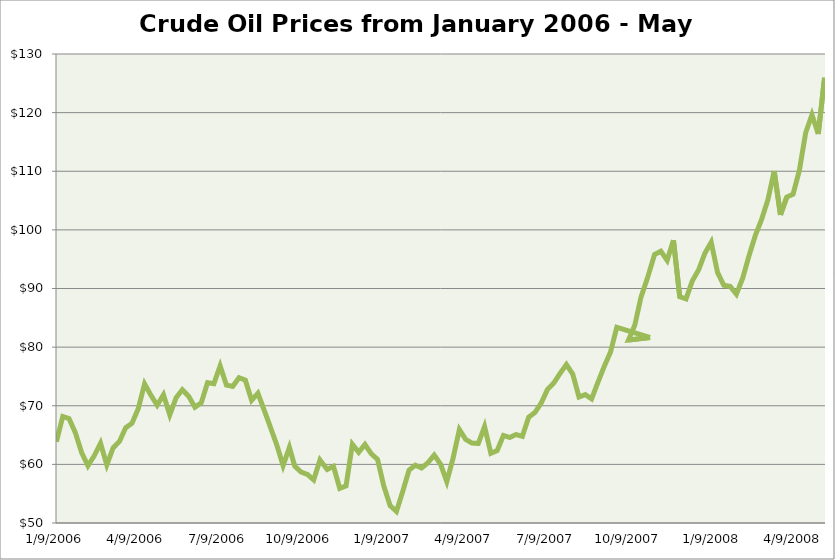
| Category | Series 0 |
|---|---|
| 1/9/06 | 63.86 |
| 1/16/06 | 68.16 |
| 1/23/06 | 67.81 |
| 1/30/06 | 65.41 |
| 2/6/06 | 62.01 |
| 2/13/06 | 59.76 |
| 2/20/06 | 61.46 |
| 2/27/06 | 63.61 |
| 3/6/06 | 59.91 |
| 3/13/06 | 62.81 |
| 3/20/06 | 63.9 |
| 3/27/06 | 66.25 |
| 4/3/06 | 67.02 |
| 4/10/06 | 69.53 |
| 4/17/06 | 73.73 |
| 4/24/06 | 71.8 |
| 5/1/06 | 70.09 |
| 5/8/06 | 71.87 |
| 5/15/06 | 68.44 |
| 5/22/06 | 71.35 |
| 5/29/06 | 72.73 |
| 6/5/06 | 71.62 |
| 6/12/06 | 69.75 |
| 6/19/06 | 70.5 |
| 6/26/06 | 73.94 |
| 7/3/06 | 73.76 |
| 7/10/06 | 76.8 |
| 7/17/06 | 73.52 |
| 7/24/06 | 73.3 |
| 7/31/06 | 74.78 |
| 8/7/06 | 74.38 |
| 8/14/06 | 70.93 |
| 8/21/06 | 72.13 |
| 8/28/06 | 69.24 |
| 9/4/06 | 66.3 |
| 9/11/06 | 63.3 |
| 9/18/06 | 59.79 |
| 9/25/06 | 62.9 |
| 10/1/06 | 59.68 |
| 10/8/06 | 58.69 |
| 10/15/06 | 58.29 |
| 10/22/06 | 57.35 |
| 10/29/06 | 60.75 |
| 11/6/06 | 59.13 |
| 11/13/06 | 59.66 |
| 11/20/06 | 55.9 |
| 11/27/06 | 56.33 |
| 12/4/06 | 63.43 |
| 12/11/06 | 62.06 |
| 12/18/06 | 63.4 |
| 12/25/06 | 61.81 |
| 1/1/07 | 60.85 |
| 1/8/07 | 56.29 |
| 1/15/07 | 52.96 |
| 1/22/07 | 51.98 |
| 1/29/07 | 55.38 |
| 2/5/07 | 59.01 |
| 2/12/07 | 59.86 |
| 2/19/07 | 59.38 |
| 2/26/07 | 60.28 |
| 3/5/07 | 61.58 |
| 3/12/07 | 60.06 |
| 3/19/07 | 57.06 |
| 3/26/07 | 61.07 |
| 4/2/07 | 65.94 |
| 4/9/07 | 64.26 |
| 4/16/07 | 63.63 |
| 4/23/07 | 63.56 |
| 4/30/07 | 66.45 |
| 5/7/07 | 61.89 |
| 5/14/07 | 62.35 |
| 5/21/07 | 64.93 |
| 5/28/07 | 64.59 |
| 6/4/07 | 65.09 |
| 6/11/07 | 64.78 |
| 6/18/07 | 68.04 |
| 6/25/07 | 68.85 |
| 7/2/07 | 70.47 |
| 7/9/07 | 72.8 |
| 7/16/07 | 73.89 |
| 7/23/07 | 75.53 |
| 7/30/07 | 77.03 |
| 8/6/07 | 75.41 |
| 8/13/07 | 71.49 |
| 8/20/07 | 71.9 |
| 8/27/07 | 71.17 |
| 9/3/07 | 73.98 |
| 9/10/07 | 76.7 |
| 9/17/07 | 79.14 |
| 9/24/07 | 83.38 |
| 10/31/07 | 81.64 |
| 10/7/07 | 81.2 |
| 10/14/07 | 83.73 |
| 10/21/07 | 88.58 |
| 10/28/07 | 91.73 |
| 11/5/07 | 95.81 |
| 11/12/07 | 96.36 |
| 11/19/07 | 94.81 |
| 11/26/07 | 98.24 |
| 12/3/07 | 88.6 |
| 12/10/07 | 88.23 |
| 12/17/07 | 91.31 |
| 12/24/07 | 93.19 |
| 12/31/07 | 96.03 |
| 1/7/08 | 97.9 |
| 1/14/08 | 92.74 |
| 1/21/08 | 90.55 |
| 1/28/08 | 90.37 |
| 2/4/08 | 89.03 |
| 2/11/08 | 91.77 |
| 2/18/08 | 95.57 |
| 2/25/08 | 99.03 |
| 3/3/08 | 101.78 |
| 3/10/08 | 105.12 |
| 3/17/08 | 110.03 |
| 3/24/08 | 102.57 |
| 3/31/08 | 105.59 |
| 4/7/08 | 106.09 |
| 4/14/08 | 110.14 |
| 4/21/08 | 116.56 |
| 4/28/08 | 119.64 |
| 5/5/08 | 116.36 |
| 5/12/08 | 125.94 |